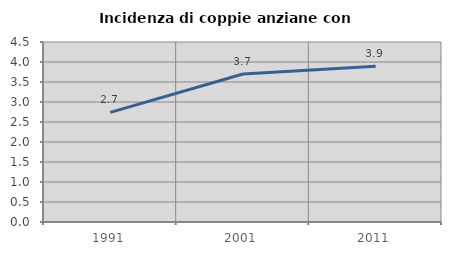
| Category | Incidenza di coppie anziane con figli |
|---|---|
| 1991.0 | 2.74 |
| 2001.0 | 3.701 |
| 2011.0 | 3.892 |